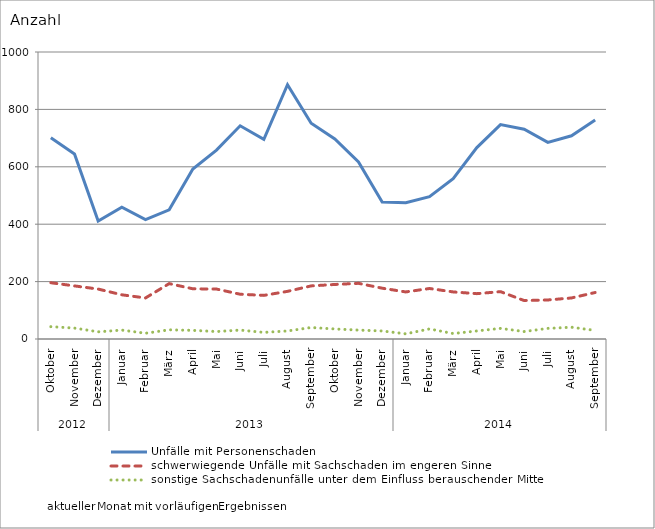
| Category | Unfälle mit Personenschaden | schwerwiegende Unfälle mit Sachschaden im engeren Sinne | sonstige Sachschadenunfälle unter dem Einfluss berauschender Mittel |
|---|---|---|---|
| 0 | 701 | 196 | 43 |
| 1 | 645 | 185 | 38 |
| 2 | 411 | 174 | 25 |
| 3 | 459 | 154 | 31 |
| 4 | 416 | 143 | 20 |
| 5 | 450 | 193 | 32 |
| 6 | 592 | 175 | 30 |
| 7 | 658 | 174 | 26 |
| 8 | 743 | 156 | 31 |
| 9 | 696 | 152 | 23 |
| 10 | 886 | 166 | 28 |
| 11 | 752 | 185 | 40 |
| 12 | 697 | 190 | 35 |
| 13 | 617 | 194 | 31 |
| 14 | 477 | 177 | 28 |
| 15 | 475 | 164 | 18 |
| 16 | 496 | 176 | 35 |
| 17 | 559 | 164 | 19 |
| 18 | 667 | 158 | 28 |
| 19 | 747 | 165 | 37 |
| 20 | 731 | 134 | 26 |
| 21 | 685 | 136 | 37 |
| 22 | 708 | 143 | 41 |
| 23 | 763 | 162 | 30 |